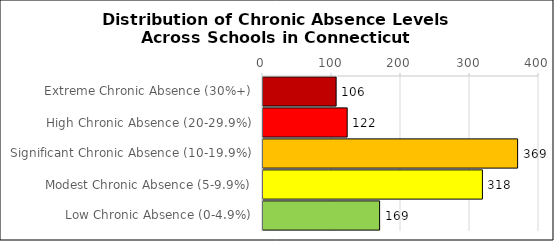
| Category | Number of Schools |
|---|---|
| Extreme Chronic Absence (30%+) | 106 |
| High Chronic Absence (20-29.9%) | 122 |
| Significant Chronic Absence (10-19.9%) | 369 |
| Modest Chronic Absence (5-9.9%) | 318 |
| Low Chronic Absence (0-4.9%) | 169 |